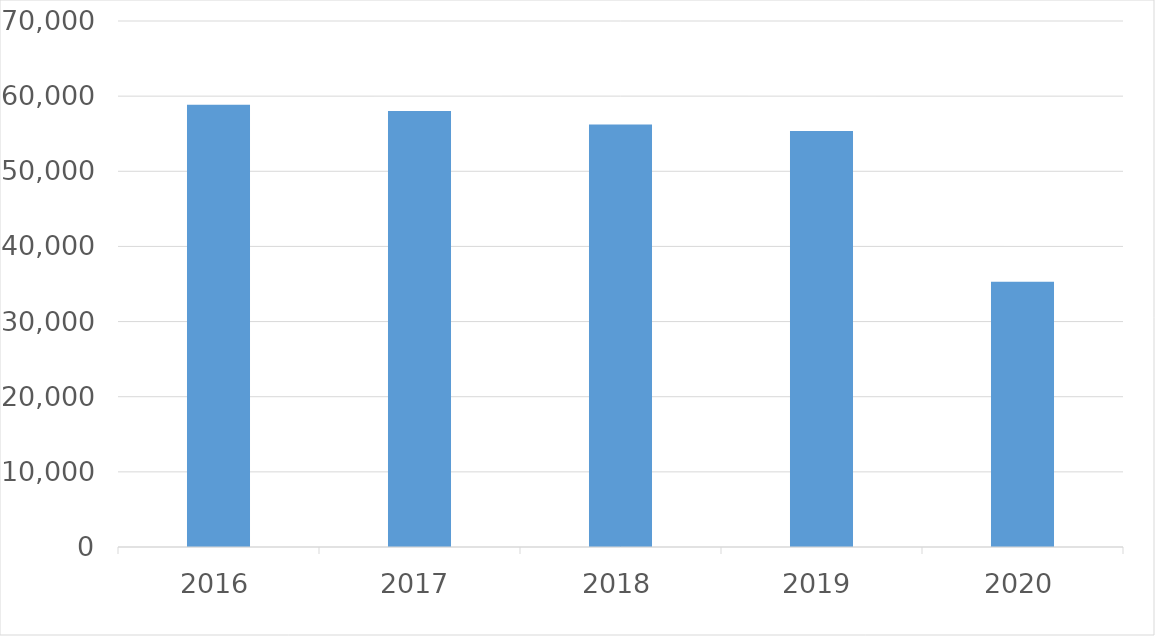
| Category | Series 0 |
|---|---|
| 2016 | 58861 |
| 2017 | 58025 |
| 2018 | 56231 |
| 2019 | 55353 |
| 2020 | 35315 |